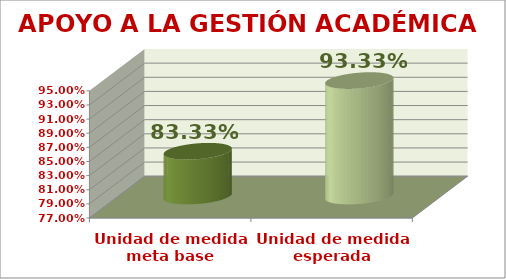
| Category | APOYO A LA GESTIÓN ACADÉMICA |
|---|---|
| Unidad de medida meta base | 0.833 |
| Unidad de medida esperada | 0.933 |